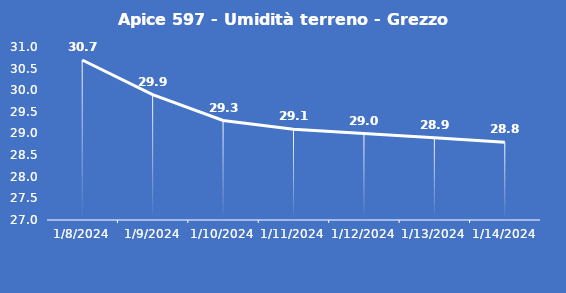
| Category | Apice 597 - Umidità terreno - Grezzo (%VWC) |
|---|---|
| 1/8/24 | 30.7 |
| 1/9/24 | 29.9 |
| 1/10/24 | 29.3 |
| 1/11/24 | 29.1 |
| 1/12/24 | 29 |
| 1/13/24 | 28.9 |
| 1/14/24 | 28.8 |